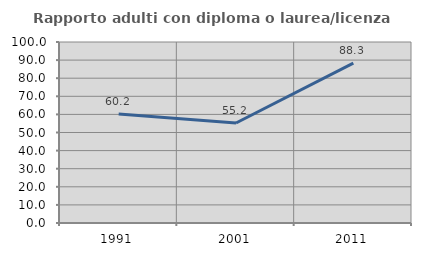
| Category | Rapporto adulti con diploma o laurea/licenza media  |
|---|---|
| 1991.0 | 60.199 |
| 2001.0 | 55.238 |
| 2011.0 | 88.333 |